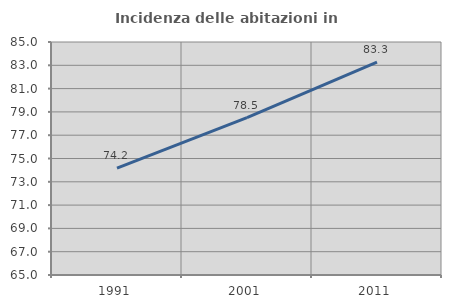
| Category | Incidenza delle abitazioni in proprietà  |
|---|---|
| 1991.0 | 74.177 |
| 2001.0 | 78.501 |
| 2011.0 | 83.282 |